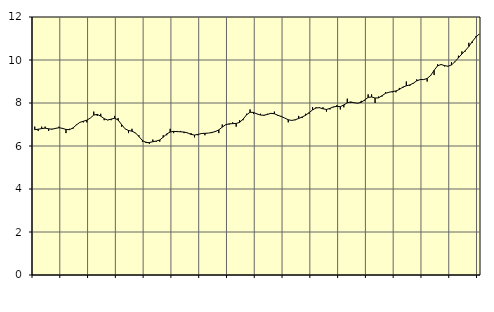
| Category | Piggar | Offentlig förvaltning m.m., SNI 84, 99 |
|---|---|---|
| nan | 6.9 | 6.76 |
| 87.0 | 6.7 | 6.78 |
| 87.0 | 6.9 | 6.81 |
| 87.0 | 6.9 | 6.83 |
| nan | 6.7 | 6.8 |
| 88.0 | 6.8 | 6.78 |
| 88.0 | 6.8 | 6.82 |
| 88.0 | 6.9 | 6.85 |
| nan | 6.8 | 6.82 |
| 89.0 | 6.6 | 6.77 |
| 89.0 | 6.8 | 6.76 |
| 89.0 | 6.8 | 6.84 |
| nan | 7 | 6.98 |
| 90.0 | 7.1 | 7.1 |
| 90.0 | 7.1 | 7.15 |
| 90.0 | 7.1 | 7.2 |
| nan | 7.3 | 7.3 |
| 91.0 | 7.6 | 7.44 |
| 91.0 | 7.4 | 7.47 |
| 91.0 | 7.5 | 7.39 |
| nan | 7.2 | 7.27 |
| 92.0 | 7.2 | 7.21 |
| 92.0 | 7.2 | 7.25 |
| 92.0 | 7.4 | 7.29 |
| nan | 7.3 | 7.21 |
| 93.0 | 6.9 | 7 |
| 93.0 | 6.8 | 6.8 |
| 93.0 | 6.6 | 6.72 |
| nan | 6.8 | 6.69 |
| 94.0 | 6.6 | 6.61 |
| 94.0 | 6.5 | 6.44 |
| 94.0 | 6.2 | 6.26 |
| nan | 6.2 | 6.16 |
| 95.0 | 6.1 | 6.16 |
| 95.0 | 6.3 | 6.2 |
| 95.0 | 6.2 | 6.23 |
| nan | 6.2 | 6.28 |
| 96.0 | 6.5 | 6.41 |
| 96.0 | 6.5 | 6.56 |
| 96.0 | 6.8 | 6.65 |
| nan | 6.6 | 6.68 |
| 97.0 | 6.7 | 6.67 |
| 97.0 | 6.7 | 6.66 |
| 97.0 | 6.6 | 6.65 |
| nan | 6.6 | 6.61 |
| 98.0 | 6.6 | 6.54 |
| 98.0 | 6.4 | 6.51 |
| 98.0 | 6.5 | 6.54 |
| nan | 6.6 | 6.58 |
| 99.0 | 6.5 | 6.59 |
| 99.0 | 6.6 | 6.6 |
| 99.0 | 6.6 | 6.63 |
| nan | 6.7 | 6.67 |
| 0.0 | 6.6 | 6.75 |
| 0.0 | 7 | 6.88 |
| 0.0 | 7 | 6.99 |
| nan | 7 | 7.03 |
| 1.0 | 7.1 | 7.04 |
| 1.0 | 6.9 | 7.05 |
| 1.0 | 7.2 | 7.1 |
| nan | 7.2 | 7.25 |
| 2.0 | 7.5 | 7.45 |
| 2.0 | 7.7 | 7.57 |
| 2.0 | 7.5 | 7.56 |
| nan | 7.5 | 7.49 |
| 3.0 | 7.5 | 7.44 |
| 3.0 | 7.4 | 7.43 |
| 3.0 | 7.5 | 7.47 |
| nan | 7.5 | 7.52 |
| 4.0 | 7.6 | 7.5 |
| 4.0 | 7.4 | 7.43 |
| 4.0 | 7.4 | 7.37 |
| nan | 7.3 | 7.3 |
| 5.0 | 7.1 | 7.22 |
| 5.0 | 7.2 | 7.19 |
| 5.0 | 7.2 | 7.22 |
| nan | 7.4 | 7.28 |
| 6.0 | 7.3 | 7.35 |
| 6.0 | 7.5 | 7.43 |
| 6.0 | 7.5 | 7.55 |
| nan | 7.8 | 7.68 |
| 7.0 | 7.8 | 7.77 |
| 7.0 | 7.8 | 7.78 |
| 7.0 | 7.8 | 7.73 |
| nan | 7.6 | 7.7 |
| 8.0 | 7.7 | 7.75 |
| 8.0 | 7.8 | 7.82 |
| 8.0 | 7.9 | 7.84 |
| nan | 7.7 | 7.83 |
| 9.0 | 7.8 | 7.91 |
| 9.0 | 8.2 | 8.01 |
| 9.0 | 8 | 8.05 |
| nan | 8 | 8.01 |
| 10.0 | 8 | 7.99 |
| 10.0 | 8.1 | 8.03 |
| 10.0 | 8.1 | 8.14 |
| nan | 8.4 | 8.26 |
| 11.0 | 8.4 | 8.28 |
| 11.0 | 8 | 8.23 |
| 11.0 | 8.3 | 8.24 |
| nan | 8.3 | 8.34 |
| 12.0 | 8.5 | 8.45 |
| 12.0 | 8.5 | 8.5 |
| 12.0 | 8.5 | 8.53 |
| nan | 8.5 | 8.56 |
| 13.0 | 8.7 | 8.63 |
| 13.0 | 8.7 | 8.74 |
| 13.0 | 9 | 8.8 |
| nan | 8.8 | 8.84 |
| 14.0 | 8.9 | 8.92 |
| 14.0 | 9.1 | 9.03 |
| 14.0 | 9.1 | 9.09 |
| nan | 9.1 | 9.09 |
| 15.0 | 9 | 9.14 |
| 15.0 | 9.3 | 9.28 |
| 15.0 | 9.3 | 9.52 |
| nan | 9.8 | 9.73 |
| 16.0 | 9.8 | 9.79 |
| 16.0 | 9.7 | 9.74 |
| 16.0 | 9.7 | 9.71 |
| nan | 9.9 | 9.77 |
| 17.0 | 9.9 | 9.92 |
| 17.0 | 10.2 | 10.1 |
| 17.0 | 10.4 | 10.28 |
| nan | 10.4 | 10.44 |
| 18.0 | 10.8 | 10.63 |
| 18.0 | 10.8 | 10.86 |
| 18.0 | 11.1 | 11.06 |
| nan | 11.2 | 11.21 |